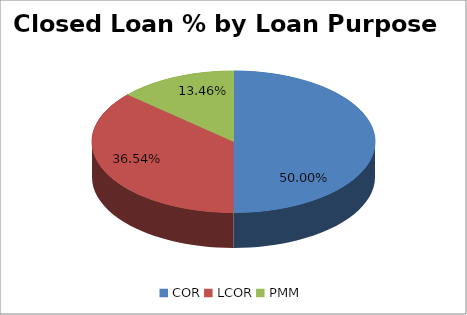
| Category | Closed Loan % (Current Month) |
|---|---|
| COR | 0.5 |
| LCOR | 0.365 |
| PMM | 0.135 |